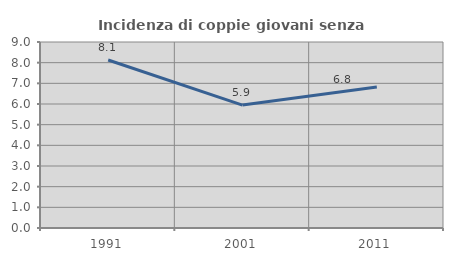
| Category | Incidenza di coppie giovani senza figli |
|---|---|
| 1991.0 | 8.127 |
| 2001.0 | 5.949 |
| 2011.0 | 6.824 |